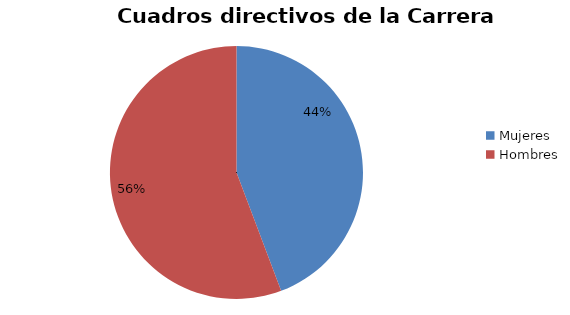
| Category | Series 0 |
|---|---|
| Mujeres | 54 |
| Hombres | 68 |